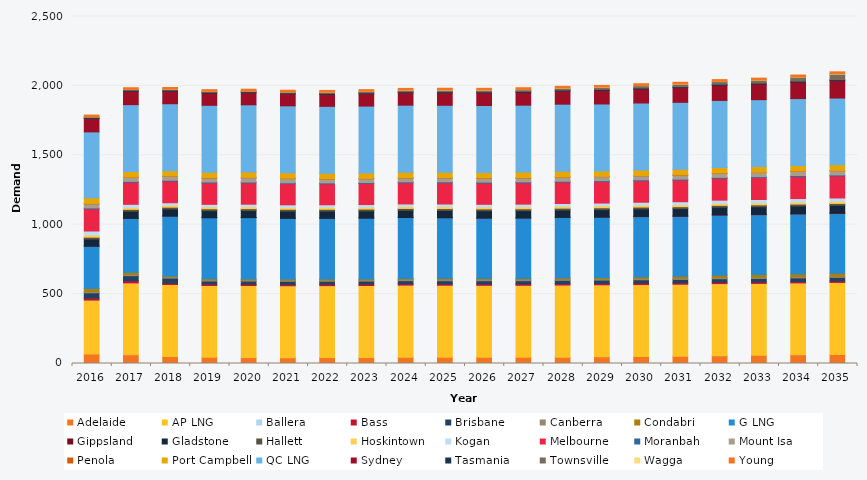
| Category | Adelaide | AP LNG | Ballera | Bass | Brisbane | Canberra | Condabri | G LNG | Gippsland | Gladstone | Hallett | Hoskintown | Kogan | Melbourne | Moranbah | Mount Isa | Penola | Port Campbell | QC LNG | Sydney | Tasmania | Townsville | Wagga | Young |
|---|---|---|---|---|---|---|---|---|---|---|---|---|---|---|---|---|---|---|---|---|---|---|---|---|
| 2016.0 | 68.04 | 388.69 | 0.014 | 15.538 | 36.808 | 8.587 | 22.47 | 305.178 | 0.592 | 50.543 | 13.76 | 15.857 | 28.508 | 159.784 | 6.43 | 29.515 | 2.626 | 41.738 | 474.034 | 95.899 | 6.69 | 6.429 | 0.173 | 12.073 |
| 2017.0 | 63.017 | 517.774 | 0.016 | 15.524 | 36.367 | 8.631 | 15.429 | 389.235 | 0.563 | 50.086 | 13.723 | 14.216 | 22.208 | 158.9 | 6.358 | 28.261 | 2.551 | 39.604 | 482.502 | 96.288 | 6.768 | 6.505 | 0.092 | 12.117 |
| 2018.0 | 51.252 | 517.774 | 0.035 | 9.966 | 36.066 | 8.622 | 7.21 | 431.486 | 0.566 | 49.663 | 13.695 | 14.067 | 17.887 | 155.731 | 6.291 | 28.131 | 2.535 | 38.038 | 482.502 | 91.287 | 6.786 | 6.738 | 0.145 | 12.111 |
| 2019.0 | 44.437 | 517.774 | 0.017 | 9.909 | 22.081 | 8.578 | 7.374 | 440.174 | 0.591 | 50.219 | 13.597 | 13.61 | 18.336 | 154.547 | 6.25 | 28.083 | 2.47 | 39.454 | 482.502 | 87.349 | 6.844 | 6.546 | 0.085 | 12.081 |
| 2020.0 | 42.429 | 519.159 | 0.008 | 9.915 | 22.096 | 8.487 | 7.562 | 441.353 | 0.575 | 50.357 | 13.536 | 13.92 | 18.254 | 153.558 | 6.419 | 30.881 | 2.436 | 39.064 | 483.793 | 87.015 | 6.895 | 6.349 | 0.052 | 12.025 |
| 2021.0 | 42.326 | 517.792 | 0.021 | 9.862 | 22.023 | 8.375 | 7.509 | 438.63 | 0.578 | 50.42 | 13.491 | 13.753 | 18.503 | 152.058 | 6.569 | 30.387 | 2.425 | 39.173 | 482.474 | 86.521 | 6.939 | 6.957 | 0.083 | 11.935 |
| 2022.0 | 42.993 | 517.822 | 0.027 | 9.78 | 21.843 | 8.319 | 7.387 | 438.63 | 0.564 | 50.266 | 13.373 | 14.328 | 18.257 | 150.935 | 6.68 | 27.517 | 2.406 | 39.205 | 482.43 | 86.735 | 6.977 | 8.642 | 0.446 | 11.865 |
| 2023.0 | 44.039 | 517.851 | 0.041 | 9.836 | 22.019 | 8.347 | 7.52 | 438.279 | 0.716 | 50.492 | 13.454 | 13.919 | 18.758 | 151.548 | 6.694 | 27.672 | 2.45 | 38.649 | 482.386 | 88.53 | 7.01 | 9.701 | 1.239 | 11.906 |
| 2024.0 | 45.205 | 519.267 | 0.061 | 9.919 | 22.299 | 8.428 | 7.236 | 439.452 | 0.903 | 50.759 | 13.549 | 13.977 | 18.496 | 152.471 | 6.715 | 27.367 | 2.486 | 38.88 | 483.633 | 89.945 | 7.038 | 10.246 | 1.666 | 11.999 |
| 2025.0 | 45.788 | 517.911 | 0.063 | 10.011 | 22.586 | 8.506 | 7.663 | 437.571 | 1.146 | 51.033 | 13.665 | 13.856 | 19.322 | 153.146 | 6.737 | 27.579 | 2.487 | 38.757 | 482.298 | 91.083 | 7.061 | 10.788 | 1.955 | 12.087 |
| 2026.0 | 45.324 | 517.94 | 0.067 | 10.08 | 22.856 | 8.584 | 7.425 | 435.47 | 1.124 | 51.291 | 13.645 | 13.92 | 19.3 | 153.292 | 6.756 | 27.768 | 2.519 | 39.05 | 482.255 | 91.686 | 7.079 | 11.1 | 1.924 | 12.173 |
| 2027.0 | 45.341 | 517.97 | 0.071 | 10.144 | 23.144 | 8.658 | 7.51 | 435.47 | 1.092 | 51.577 | 13.631 | 14.149 | 19.337 | 153.452 | 6.778 | 27.984 | 2.514 | 40.124 | 482.211 | 92.759 | 7.092 | 11.815 | 1.706 | 12.256 |
| 2028.0 | 45.873 | 519.385 | 0.065 | 10.215 | 23.435 | 8.735 | 7.97 | 436.636 | 1.39 | 51.881 | 13.61 | 13.96 | 19.51 | 153.661 | 6.801 | 28.196 | 2.508 | 41.014 | 483.457 | 95.034 | 7.1 | 12.779 | 1.396 | 12.343 |
| 2029.0 | 48.616 | 518.029 | 0.104 | 10.296 | 23.733 | 8.82 | 9.246 | 435.47 | 1.928 | 52.183 | 13.628 | 14.28 | 19.684 | 154.45 | 6.826 | 28.398 | 2.527 | 39.443 | 482.123 | 97.798 | 7.106 | 14.615 | 1.644 | 12.435 |
| 2030.0 | 50.546 | 518.058 | 0.144 | 10.389 | 24.038 | 8.911 | 11.534 | 434.501 | 2.922 | 52.483 | 13.639 | 13.821 | 20.79 | 154.935 | 6.852 | 28.608 | 2.448 | 40.033 | 482.079 | 101.426 | 7.109 | 16.368 | 1.397 | 12.533 |
| 2031.0 | 52.701 | 518.088 | 0.185 | 10.484 | 24.344 | 9.004 | 13.772 | 431.623 | 3.016 | 52.812 | 13.629 | 13.973 | 21.882 | 155.79 | 6.878 | 28.82 | 2.418 | 40.339 | 482.035 | 105.398 | 7.111 | 17.834 | 1.326 | 12.632 |
| 2032.0 | 55.776 | 519.504 | 0.23 | 10.568 | 24.655 | 9.096 | 16.312 | 432.778 | 3.708 | 53.148 | 13.69 | 14.01 | 23.354 | 156.977 | 6.905 | 29.036 | 2.435 | 39.774 | 483.281 | 109.44 | 7.113 | 19.412 | 1.396 | 12.731 |
| 2033.0 | 58.638 | 518.147 | 0.279 | 10.653 | 24.967 | 9.187 | 18.781 | 431.623 | 3.472 | 53.465 | 13.672 | 14.087 | 24.776 | 157.474 | 6.933 | 29.254 | 2.428 | 41.034 | 481.947 | 112.705 | 7.114 | 20.906 | 1.594 | 12.827 |
| 2034.0 | 62.177 | 518.177 | 0.263 | 10.741 | 25.288 | 9.279 | 19.421 | 431.623 | 4.243 | 53.798 | 13.713 | 14.28 | 25.335 | 158.637 | 6.977 | 29.484 | 2.453 | 40.725 | 481.903 | 118.934 | 7.114 | 29.126 | 1.824 | 12.927 |
| 2035.0 | 65.55 | 518.206 | 0.209 | 10.828 | 25.611 | 9.372 | 19.621 | 431.623 | 4.428 | 54.172 | 13.73 | 15.458 | 23.593 | 159.237 | 7.023 | 29.715 | 2.447 | 40.328 | 481.453 | 125.57 | 7.113 | 39.743 | 3.251 | 13.026 |